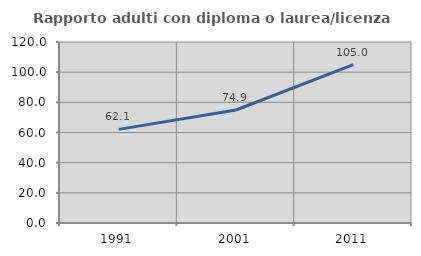
| Category | Rapporto adulti con diploma o laurea/licenza media  |
|---|---|
| 1991.0 | 62.073 |
| 2001.0 | 74.905 |
| 2011.0 | 104.96 |